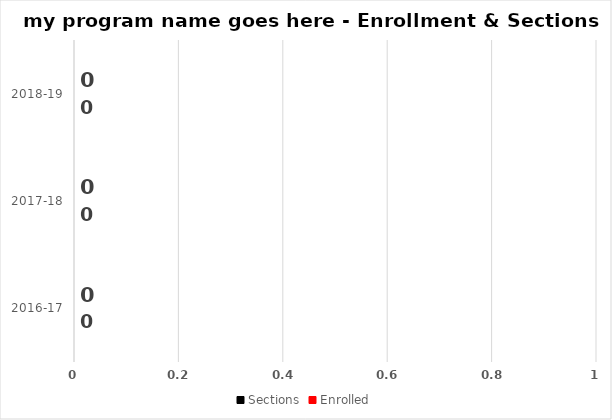
| Category | Sections | Enrolled |
|---|---|---|
| 2016-17 | 0 | 0 |
| 2017-18 | 0 | 0 |
| 2018-19 | 0 | 0 |